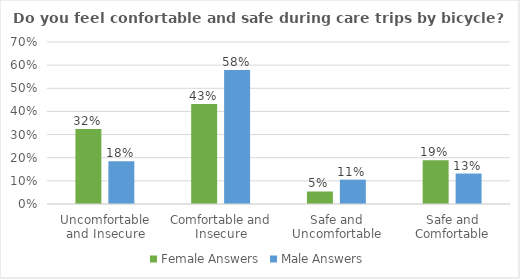
| Category | Female Answers | Male Answers |
|---|---|---|
| Uncomfortable and Insecure | 0.324 | 0.184 |
| Comfortable and Insecure | 0.432 | 0.579 |
| Safe and Uncomfortable | 0.054 | 0.105 |
| Safe and Comfortable | 0.189 | 0.132 |